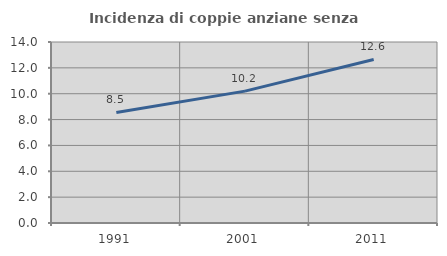
| Category | Incidenza di coppie anziane senza figli  |
|---|---|
| 1991.0 | 8.548 |
| 2001.0 | 10.199 |
| 2011.0 | 12.649 |